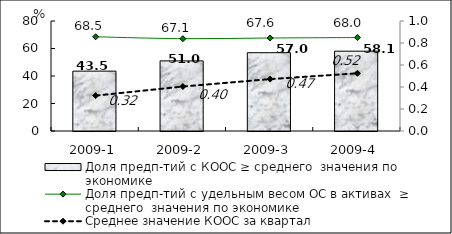
| Category | Доля предп-тий с КООС ≥ среднего  значения по экономике |
|---|---|
| 2009-1 | 43.54 |
| 2009-2 | 51 |
| 2009-3 | 56.95 |
| 2009-4 | 58.05 |